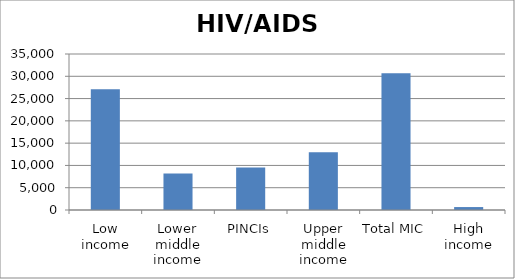
| Category | Series 0 |
|---|---|
| Low income | 27109.927 |
| Lower middle income | 8170.493 |
| PINCIs | 9525.734 |
| Upper middle income | 12984.55 |
| Total MIC | 30680.777 |
| High income | 659.416 |